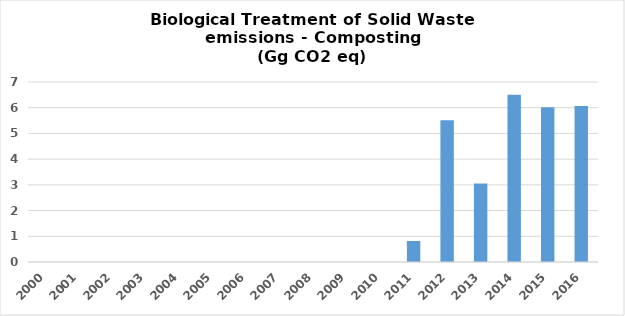
| Category | Series 0 |
|---|---|
| 2000.0 | 0 |
| 2001.0 | 0 |
| 2002.0 | 0 |
| 2003.0 | 0 |
| 2004.0 | 0 |
| 2005.0 | 0 |
| 2006.0 | 0 |
| 2007.0 | 0 |
| 2008.0 | 0 |
| 2009.0 | 0 |
| 2010.0 | 0 |
| 2011.0 | 0.816 |
| 2012.0 | 5.51 |
| 2013.0 | 3.05 |
| 2014.0 | 6.499 |
| 2015.0 | 6.016 |
| 2016.0 | 6.068 |